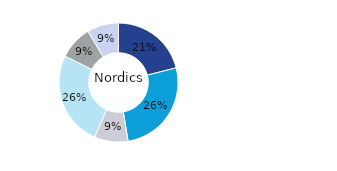
| Category | Nordics |
|---|---|
| Office | 0.21 |
| Residential | 0.264 |
| Retail | 0.092 |
| Logistics* | 0.257 |
| Public Sector | 0.091 |
| Other | 0.086 |